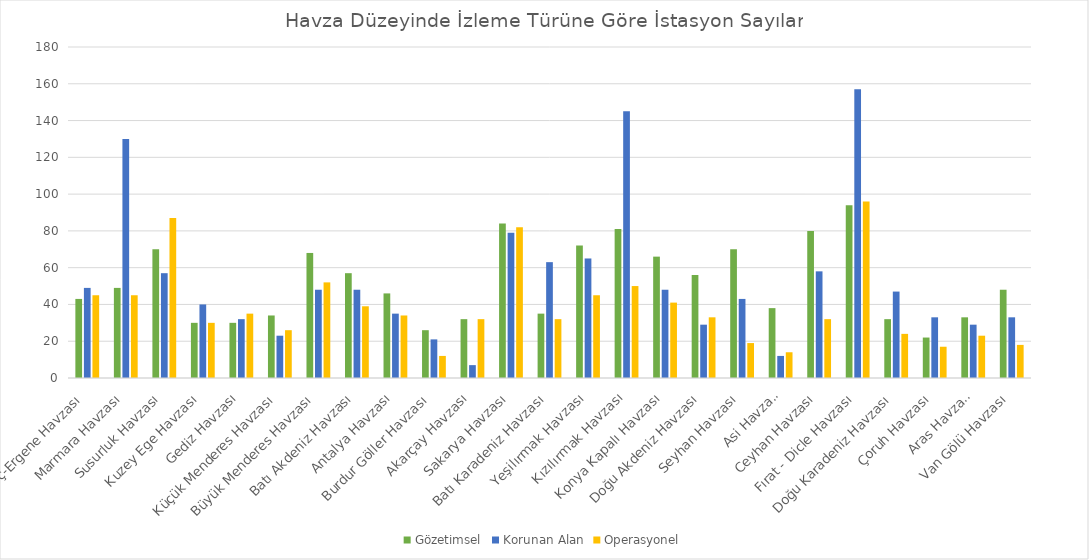
| Category | Gözetimsel | Korunan Alan | Operasyonel |
|---|---|---|---|
| Meriç-Ergene Havzası | 43 | 49 | 45 |
| Marmara Havzası | 49 | 130 | 45 |
| Susurluk Havzası | 70 | 57 | 87 |
| Kuzey Ege Havzası | 30 | 40 | 30 |
| Gediz Havzası | 30 | 32 | 35 |
| Küçük Menderes Havzası | 34 | 23 | 26 |
| Büyük Menderes Havzası | 68 | 48 | 52 |
| Batı Akdeniz Havzası | 57 | 48 | 39 |
| Antalya Havzası | 46 | 35 | 34 |
| Burdur Göller Havzası | 26 | 21 | 12 |
| Akarçay Havzası | 32 | 7 | 32 |
| Sakarya Havzası | 84 | 79 | 82 |
| Batı Karadeniz Havzası | 35 | 63 | 32 |
| Yeşilırmak Havzası | 72 | 65 | 45 |
| Kızılırmak Havzası | 81 | 145 | 50 |
| Konya Kapalı Havzası | 66 | 48 | 41 |
| Doğu Akdeniz Havzası | 56 | 29 | 33 |
| Seyhan Havzası | 70 | 43 | 19 |
| Asi Havzası | 38 | 12 | 14 |
| Ceyhan Havzası | 80 | 58 | 32 |
| Fırat - Dicle Havzası | 94 | 157 | 96 |
| Doğu Karadeniz Havzası | 32 | 47 | 24 |
| Çoruh Havzası | 22 | 33 | 17 |
| Aras Havzası | 33 | 29 | 23 |
| Van Gölü Havzası | 48 | 33 | 18 |